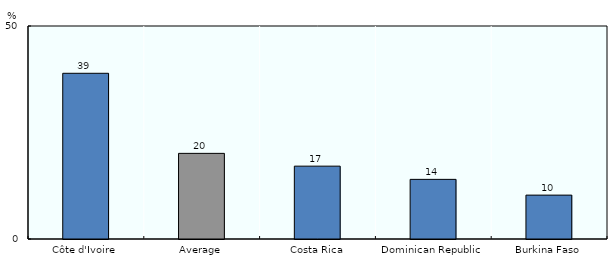
| Category | invested in host country |
|---|---|
| Côte d'Ivoire | 38.9 |
| Average | 20.1 |
| Costa Rica | 17.1 |
| Dominican Republic | 14 |
| Burkina Faso | 10.3 |